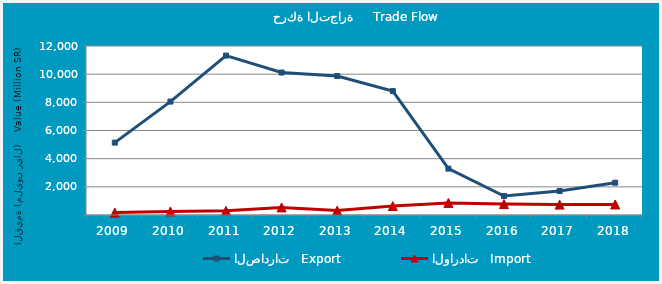
| Category | الصادرات   Export | الواردات   Import |
|---|---|---|
| 2009.0 | 5140500434 | 174086110 |
| 2010.0 | 8052891625 | 253474324 |
| 2011.0 | 11318105347 | 297469635 |
| 2012.0 | 10116574520 | 538073582 |
| 2013.0 | 9866215725 | 313799131 |
| 2014.0 | 8800622092 | 636507224 |
| 2015.0 | 3292264174 | 857952385 |
| 2016.0 | 1345268183 | 775676995 |
| 2017.0 | 1703841256 | 738523854 |
| 2018.0 | 2293279135 | 750239274 |